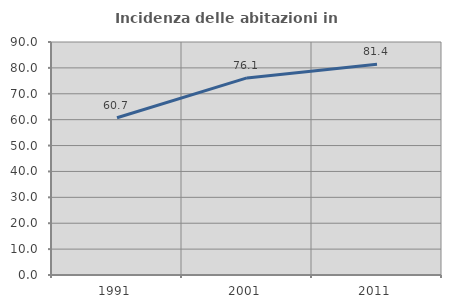
| Category | Incidenza delle abitazioni in proprietà  |
|---|---|
| 1991.0 | 60.741 |
| 2001.0 | 76.138 |
| 2011.0 | 81.448 |